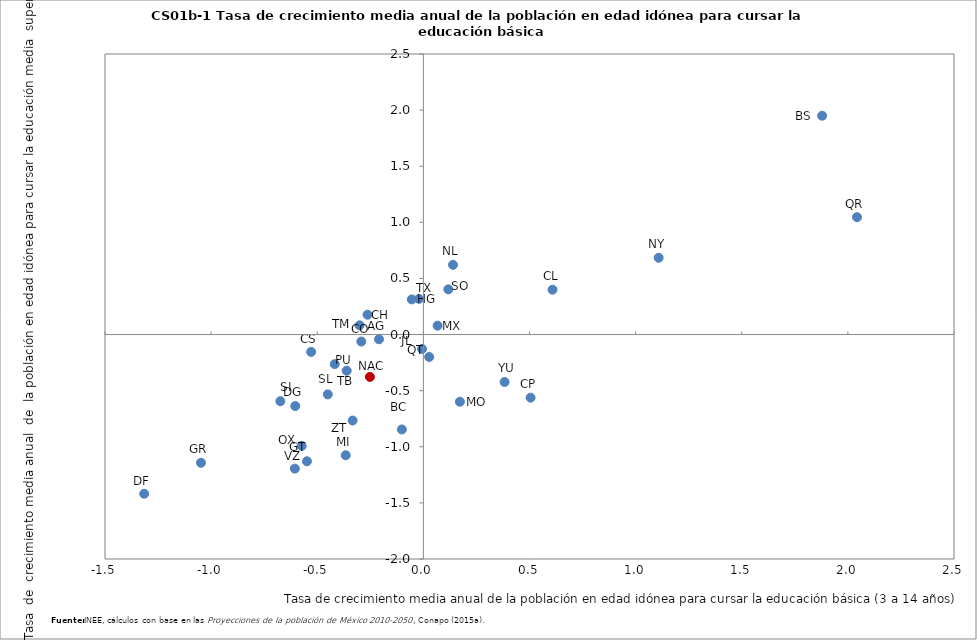
| Category | Series 0 |
|---|---|
| -0.209076 | -0.042 |
| -0.1012677 | -0.846 |
| 1.878652 | 1.95 |
| 0.5051217 | -0.562 |
| -0.2925288 | -0.062 |
| 0.6084349 | 0.4 |
| -0.5288153 | -0.155 |
| -0.2630019 | 0.177 |
| -1.315385 | -1.419 |
| -0.6034874 | -0.637 |
| -0.5485872 | -1.129 |
| -1.047871 | -1.143 |
| -0.0545676 | 0.313 |
| -0.0063232 | -0.128 |
| 0.0670001 | 0.079 |
| -0.3657998 | -1.075 |
| 0.1720394 | -0.598 |
| 1.108441 | 0.684 |
| 0.1396134 | 0.621 |
| -0.5732972 | -0.992 |
| -0.361175 | -0.322 |
| 0.0274523 | -0.2 |
| 2.042938 | 1.046 |
| -0.4501557 | -0.533 |
| -0.6738451 | -0.594 |
| 0.1174314 | 0.403 |
| -0.4175298 | -0.264 |
| -0.300695 | 0.082 |
| -0.0204679 | 0.318 |
| -0.6056178 | -1.195 |
| 0.3825232 | -0.423 |
| -0.3331732 | -0.766 |
| -0.2518665 | -0.377 |